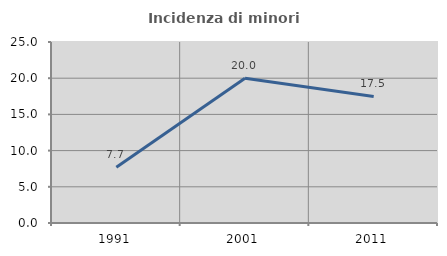
| Category | Incidenza di minori stranieri |
|---|---|
| 1991.0 | 7.692 |
| 2001.0 | 20 |
| 2011.0 | 17.476 |